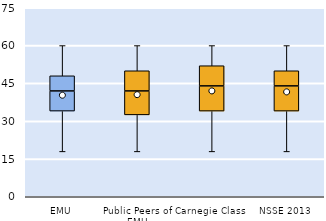
| Category | 25th | 50th | 75th |
|---|---|---|---|
| EMU | 34 | 8 | 6 |
| Public Peers of EMU | 32.5 | 9.5 | 8 |
| Carnegie Class | 34 | 10 | 8 |
| NSSE 2013 | 34 | 10 | 6 |